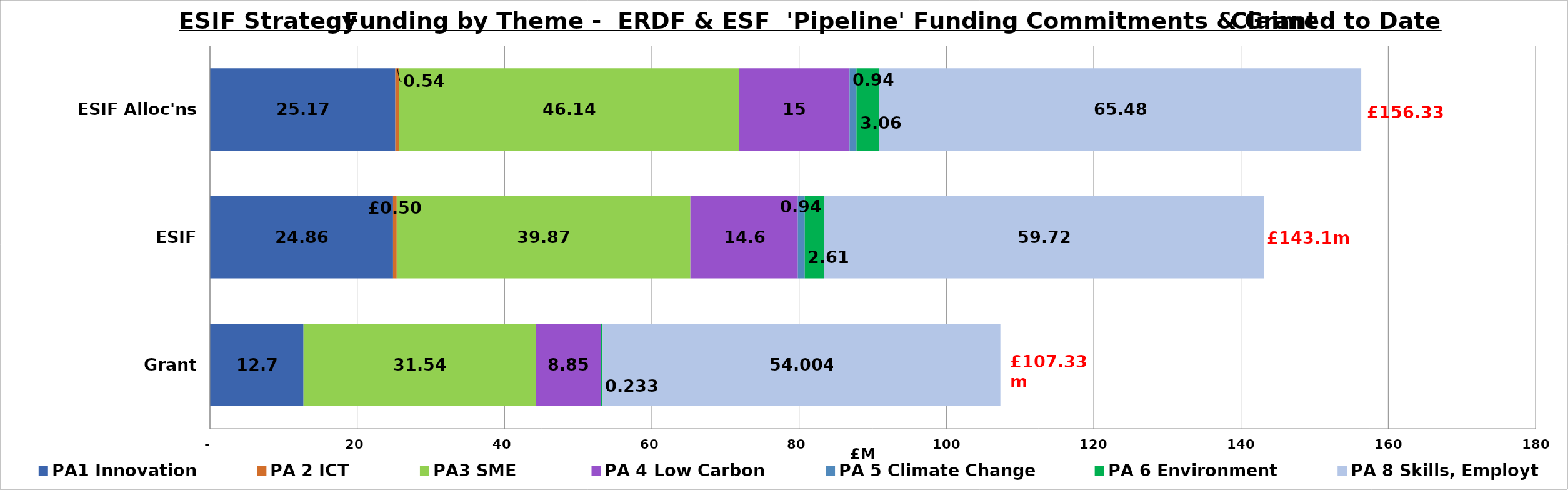
| Category | PA1 Innovation | PA 2 ICT | PA3 SME  | PA 4 Low Carbon | PA 5 Climate Change | PA 6 Environment | PA 8 Skills, Employt |
|---|---|---|---|---|---|---|---|
| Grant claimed | 12.7 | 0 | 31.54 | 8.85 | 0 | 0.233 | 54.004 |
| ESIF Comtmts | 24.86 | 0.5 | 39.87 | 14.6 | 0.94 | 2.61 | 59.72 |
| ESIF Alloc'ns | 25.17 | 0.54 | 46.14 | 15 | 0.94 | 3.06 | 65.48 |